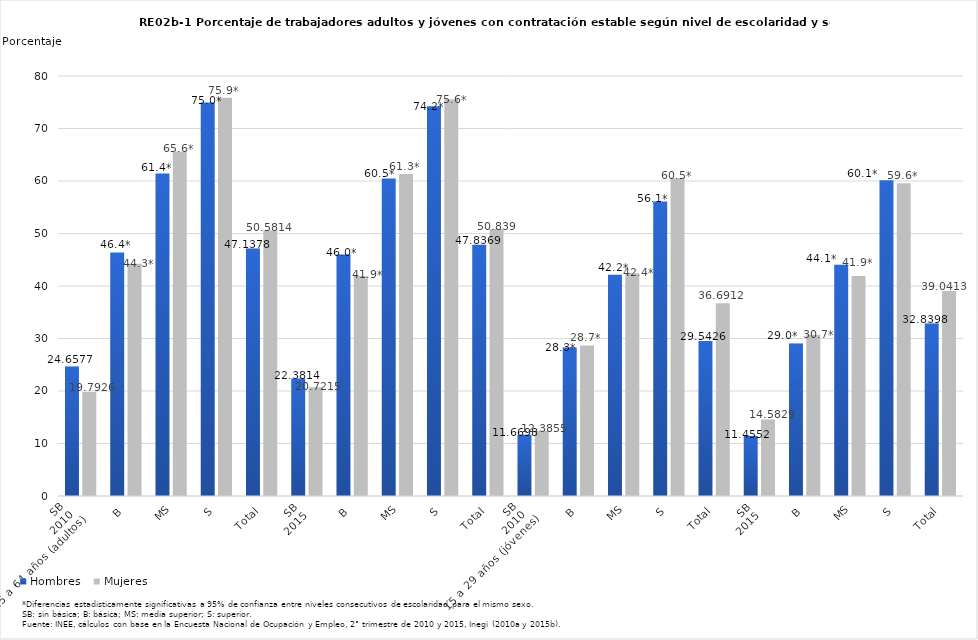
| Category | Hombres | Mujeres |
|---|---|---|
| 0 | 24.658 | 19.793 |
| 1 | 46.39 | 44.258 |
| 2 | 61.43 | 65.634 |
| 3 | 74.96 | 75.859 |
| 4 | 47.138 | 50.581 |
| 5 | 22.381 | 20.722 |
| 6 | 46.021 | 41.887 |
| 7 | 60.494 | 61.324 |
| 8 | 74.24 | 75.587 |
| 9 | 47.837 | 50.839 |
| 10 | 11.67 | 12.386 |
| 11 | 28.263 | 28.682 |
| 12 | 42.166 | 42.414 |
| 13 | 56.107 | 60.519 |
| 14 | 29.543 | 36.691 |
| 15 | 11.455 | 14.583 |
| 16 | 29.029 | 30.731 |
| 17 | 44.071 | 41.918 |
| 18 | 60.124 | 59.575 |
| 19 | 32.84 | 39.041 |